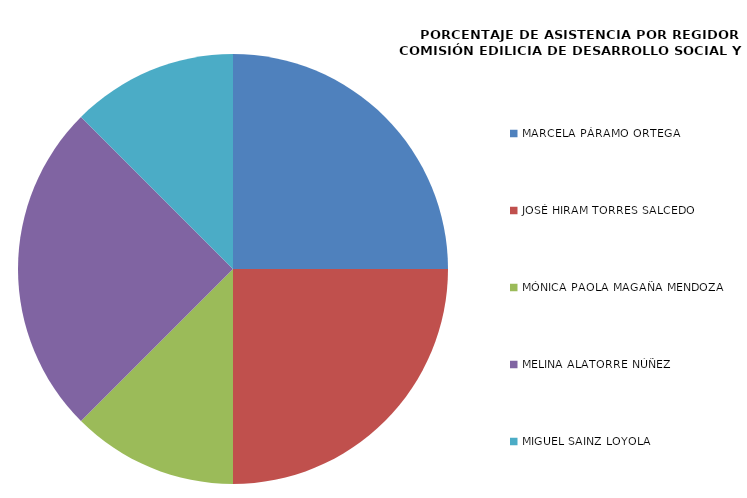
| Category | Series 0 |
|---|---|
| MARCELA PÁRAMO ORTEGA | 100 |
| JOSÉ HIRAM TORRES SALCEDO | 100 |
| MÓNICA PAOLA MAGAÑA MENDOZA | 50 |
| MELINA ALATORRE NÚÑEZ | 100 |
| MIGUEL SAINZ LOYOLA | 50 |